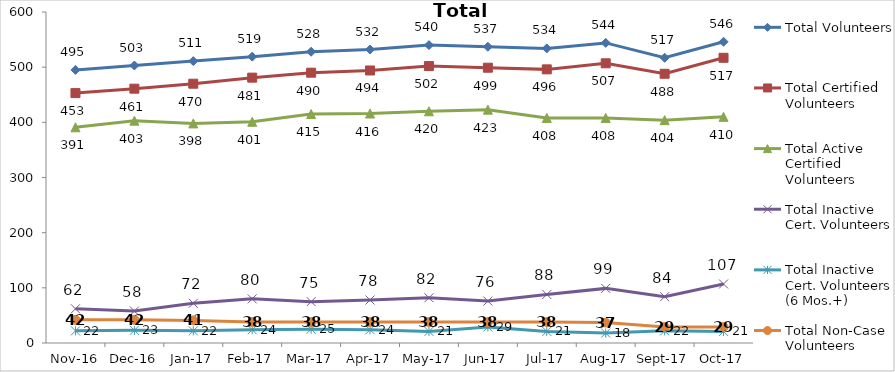
| Category | Total Volunteers | Total Certified Volunteers | Total Active Certified Volunteers | Total Inactive Cert. Volunteers | Total Inactive Cert. Volunteers (6 Mos.+) | Total Non-Case Volunteers |
|---|---|---|---|---|---|---|
| 2016-11-01 | 495 | 453 | 391 | 62 | 22 | 42 |
| 2016-12-01 | 503 | 461 | 403 | 58 | 23 | 42 |
| 2017-01-01 | 511 | 470 | 398 | 72 | 22 | 41 |
| 2017-02-01 | 519 | 481 | 401 | 80 | 24 | 38 |
| 2017-03-01 | 528 | 490 | 415 | 75 | 25 | 38 |
| 2017-04-01 | 532 | 494 | 416 | 78 | 24 | 38 |
| 2017-05-01 | 540 | 502 | 420 | 82 | 21 | 38 |
| 2017-06-01 | 537 | 499 | 423 | 76 | 29 | 38 |
| 2017-07-01 | 534 | 496 | 408 | 88 | 21 | 38 |
| 2017-08-01 | 544 | 507 | 408 | 99 | 18 | 37 |
| 2017-09-01 | 517 | 488 | 404 | 84 | 22 | 29 |
| 2017-10-01 | 546 | 517 | 410 | 107 | 21 | 29 |